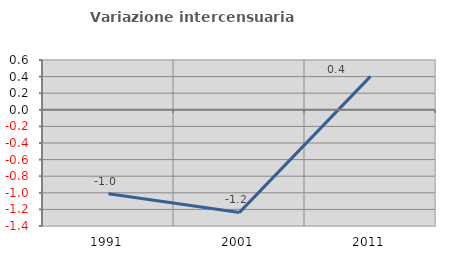
| Category | Variazione intercensuaria annua |
|---|---|
| 1991.0 | -1.012 |
| 2001.0 | -1.236 |
| 2011.0 | 0.403 |